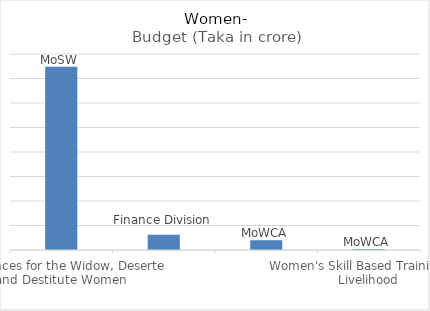
| Category | Budget (Taka in crore) |
|---|---|
| Allowances for the Widow, Deserte
and Destitute Women | 1495.4 |
| Special  Assistance Fund for Women development and
Women Entrepreneurs | 125 |
| Development of women entrepreneurs in economic empowerment at the grass root
level | 79.29 |
| Women's Skill Based Training For
Livelihood | 7.99 |